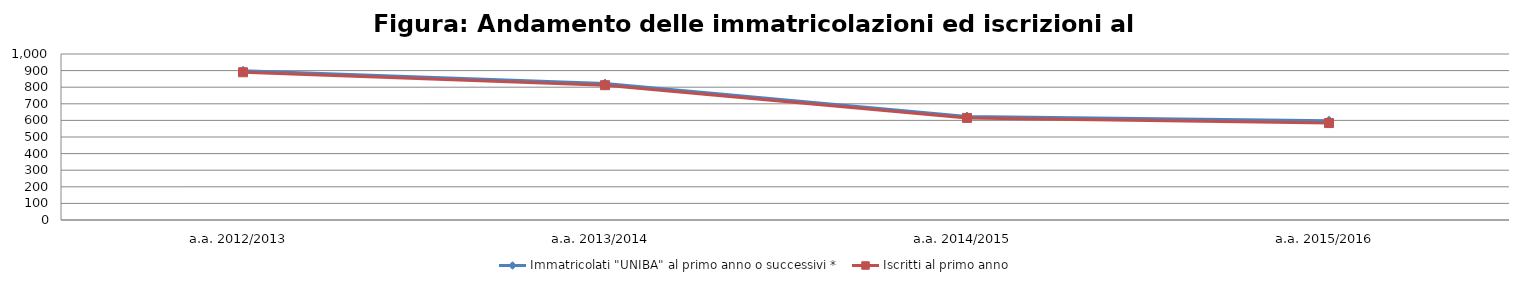
| Category | Immatricolati "UNIBA" al primo anno o successivi * | Iscritti al primo anno  |
|---|---|---|
| a.a. 2012/2013 | 899 | 890 |
| a.a. 2013/2014 | 822 | 812 |
| a.a. 2014/2015 | 623 | 615 |
| a.a. 2015/2016 | 598 | 584 |